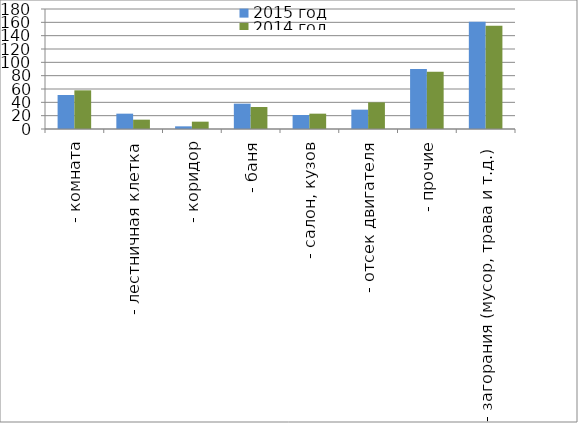
| Category | 2015 год | 2014 год |
|---|---|---|
|  - комната | 51 | 58 |
|  - лестничная клетка | 23 | 14 |
|  - коридор | 4 | 11 |
|  - баня | 38 | 33 |
|  - салон, кузов | 21 | 23 |
|  - отсек двигателя | 29 | 40 |
| - прочие | 90 | 86 |
| - загорания (мусор, трава и т.д.)  | 161 | 155 |